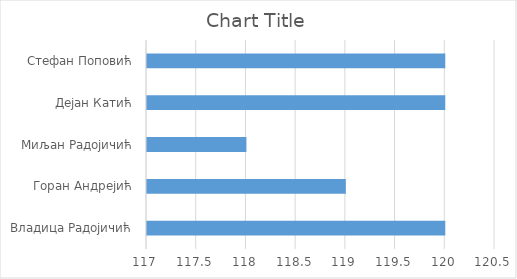
| Category | Series 0 |
|---|---|
| Владица Радојичић | 120 |
| Горан Андрејић | 119 |
| Миљан Радојичић | 118 |
| Дејан Катић | 120 |
| Стефан Поповић | 120 |